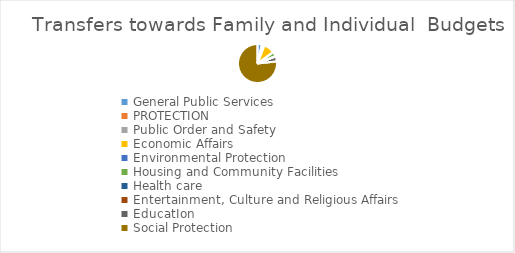
| Category | Transfers towards Family and Individual  Budgets |
|---|---|
| General Public Services | 1249905 |
| PROTECTION | 363935.1 |
| Public Order and Safety | 398630 |
| Economic Affairs | 3205724 |
| Environmental Protection | 0 |
| Housing and Community Facilities | 1322400 |
| Health care | 2000 |
| Entertainment, Culture and Religious Affairs | 100000 |
| EducatIon | 1443874 |
| Social Protection | 26650000 |